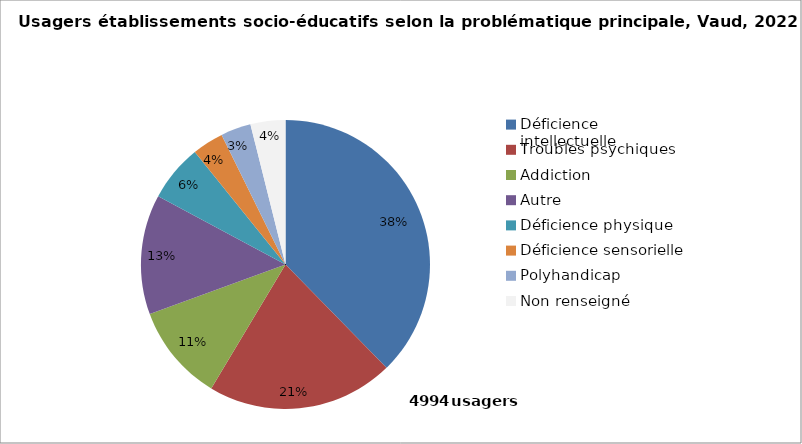
| Category | Series 0 |
|---|---|
| Déficience intellectuelle | 37.685 |
| Troubles psychiques | 20.905 |
| Addiction | 10.833 |
| Autre | 13.416 |
| Déficience physique | 6.368 |
| Déficience sensorielle | 3.504 |
| Polyhandicap | 3.384 |
| Non renseigné | 3.905 |